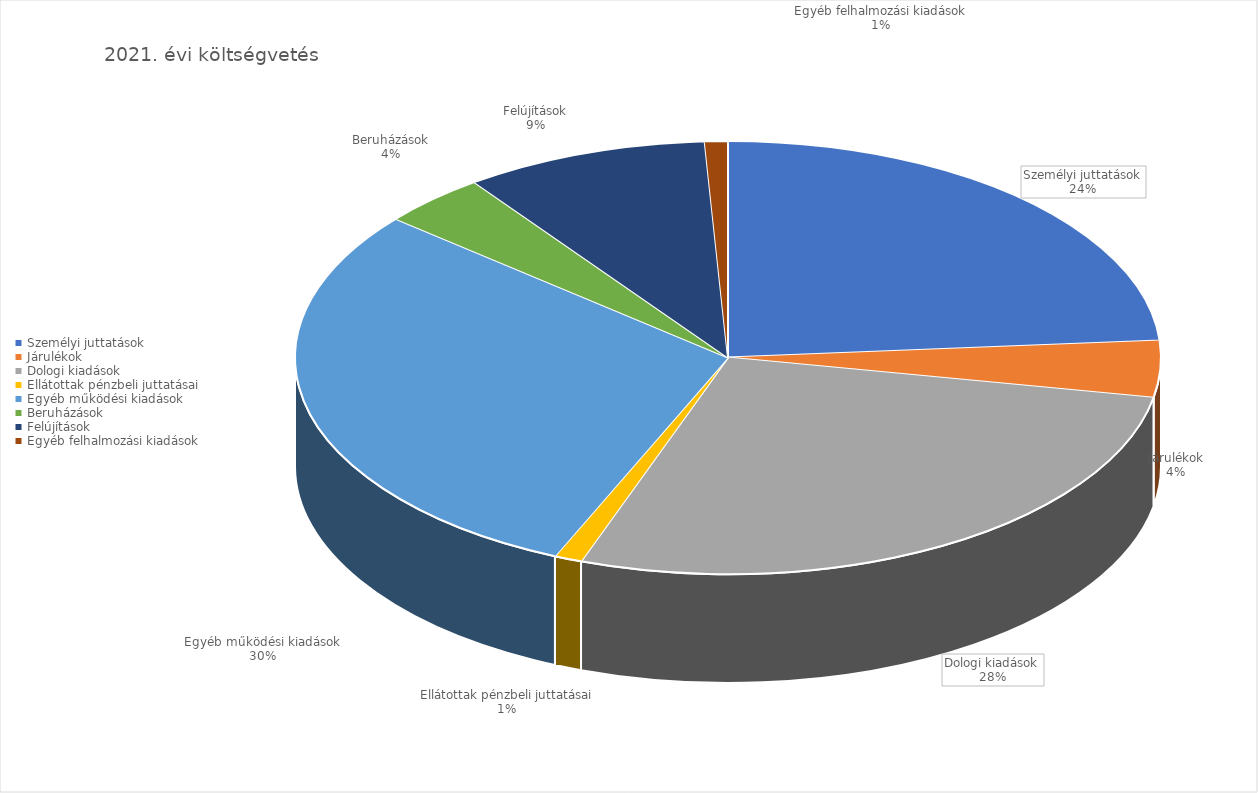
| Category | 2021 |
|---|---|
| Személyi juttatások | 9163782444 |
| Járulékok | 1632139718 |
| Dologi kiadások | 10633273898 |
| Ellátottak pénzbeli juttatásai | 398080000 |
| Egyéb működési kiadások | 11399034498 |
| Beruházások | 1529139710 |
| Felújítások | 3516708367 |
| Egyéb felhalmozási kiadások | 331057850 |